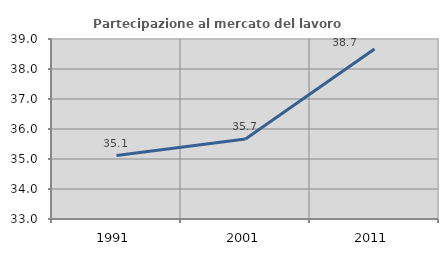
| Category | Partecipazione al mercato del lavoro  femminile |
|---|---|
| 1991.0 | 35.115 |
| 2001.0 | 35.667 |
| 2011.0 | 38.667 |